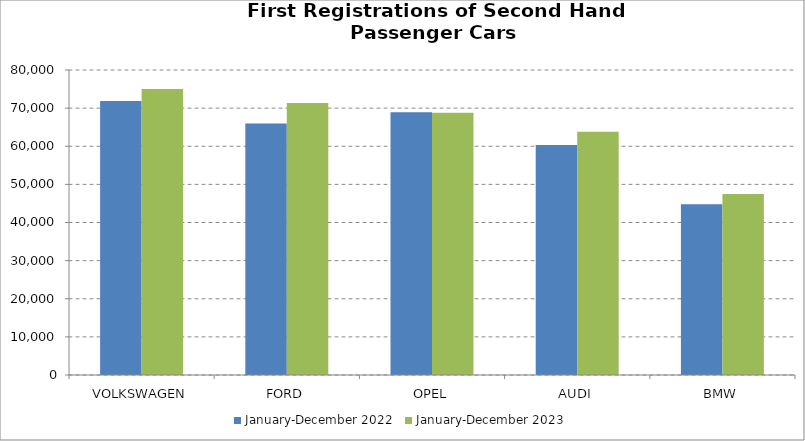
| Category | January-December 2022 | January-December 2023 |
|---|---|---|
| VOLKSWAGEN | 71863 | 74994 |
| FORD | 65961 | 71347 |
| OPEL | 68912 | 68818 |
| AUDI | 60314 | 63796 |
| BMW | 44789 | 47456 |